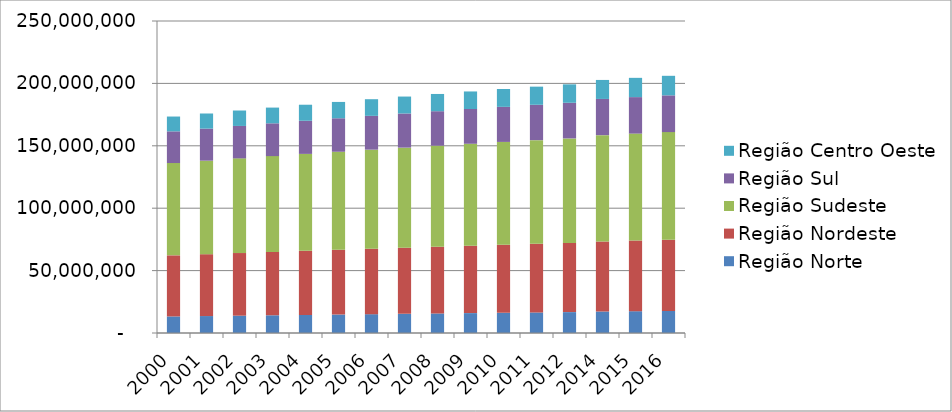
| Category | Região Norte | Região Nordeste | Região Sudeste | Região Sul | Região Centro Oeste |
|---|---|---|---|---|---|
| 2000.0 | 13270654 | 48946038 | 73974228 | 25386219 | 11871208 |
| 2001.0 | 13578120 | 49573070 | 74925027 | 25692035 | 12116977 |
| 2002.0 | 13884716 | 50188084 | 75852218 | 25989162 | 12361948 |
| 2003.0 | 14189708 | 50789908 | 76755340 | 26278032 | 12606120 |
| 2004.0 | 14492037 | 51376866 | 77634148 | 26559000 | 12849436 |
| 2005.0 | 14790808 | 51947102 | 78488527 | 26832459 | 13091910 |
| 2006.0 | 15085215 | 52499041 | 79318449 | 27098800 | 13333632 |
| 2007.0 | 15374524 | 53031557 | 80123750 | 27358348 | 13574576 |
| 2008.0 | 15658112 | 53543869 | 80904319 | 27611414 | 13814725 |
| 2009.0 | 15935514 | 54035553 | 81660443 | 27858309 | 14054150 |
| 2010.0 | 16206409 | 54506351 | 82392683 | 28099409 | 14292945 |
| 2011.0 | 16471131 | 54955883 | 83103755 | 28336491 | 14529758 |
| 2012.0 | 16730156 | 55384833 | 83795056 | 28569231 | 14763186 |
| 2014.0 | 17231027 | 56186190 | 85115623 | 29016114 | 15219608 |
| 2015.0 | 17472636 | 56560081 | 85745520 | 29230180 | 15442232 |
| 2016.0 | 17707783 | 56915936 | 86356952 | 29439773 | 15660988 |